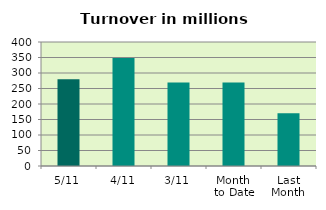
| Category | Series 0 |
|---|---|
| 5/11 | 279.554 |
| 4/11 | 348.023 |
| 3/11 | 269.419 |
| Month 
to Date | 269.361 |
| Last
Month | 170.355 |